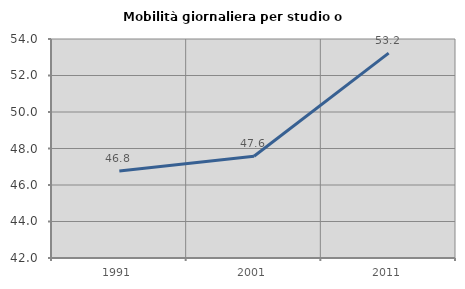
| Category | Mobilità giornaliera per studio o lavoro |
|---|---|
| 1991.0 | 46.763 |
| 2001.0 | 47.573 |
| 2011.0 | 53.226 |